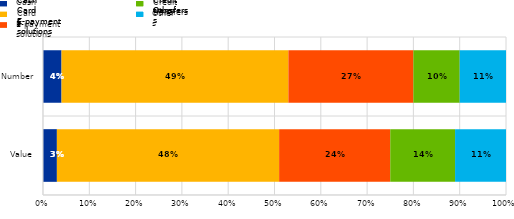
| Category | Cash | Cards | E-payment solutions | Credit transfers | Others |
|---|---|---|---|---|---|
| Value | 0.03 | 0.48 | 0.24 | 0.14 | 0.11 |
| Number | 0.04 | 0.49 | 0.27 | 0.1 | 0.11 |